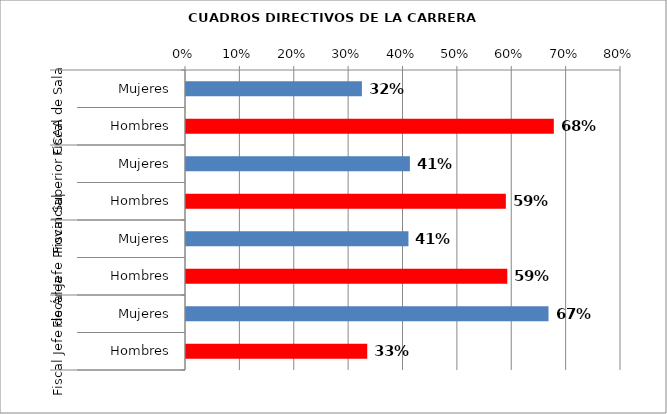
| Category | Series 0 |
|---|---|
| 0 | 0.324 |
| 1 | 0.676 |
| 2 | 0.412 |
| 3 | 0.588 |
| 4 | 0.409 |
| 5 | 0.591 |
| 6 | 0.667 |
| 7 | 0.333 |